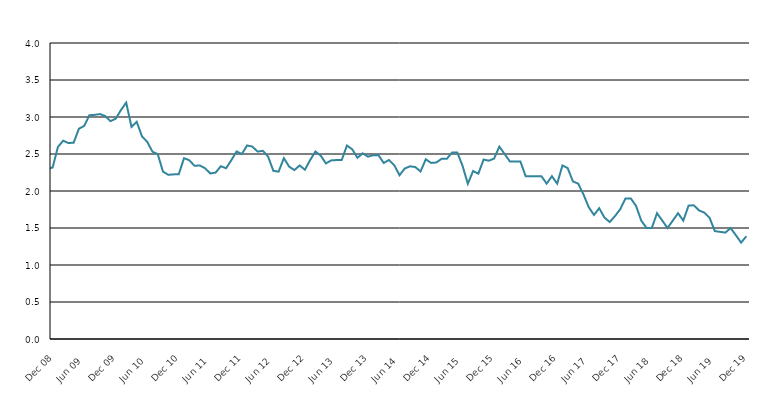
| Category | Series 1 |
|---|---|
| 2006-01-01 | 3.5 |
| 2006-02-01 | 3.4 |
| 2006-03-01 | 3.5 |
| 2006-04-01 | 3.4 |
| 2006-05-01 | 3.2 |
| 2006-06-01 | 3 |
| 2006-07-01 | 3 |
| 2006-08-01 | 3.2 |
| 2006-09-01 | 3.1 |
| 2006-10-01 | 3.1 |
| 2006-11-01 | 3 |
| 2006-12-01 | 3.3 |
| 2007-01-01 | 3.4 |
| 2007-02-01 | 3.3 |
| 2007-03-01 | 3.1 |
| 2007-04-01 | 2.8 |
| 2007-05-01 | 2.6 |
| 2007-06-01 | 2.7 |
| 2007-07-01 | 2.8 |
| 2007-08-01 | 2.9 |
| 2007-09-01 | 2.8 |
| 2007-10-01 | 2.7 |
| 2007-11-01 | 2.7 |
| 2007-12-01 | 2.7 |
| 2008-01-01 | 2.59 |
| 2008-02-01 | 2.48 |
| 2008-03-01 | 2.513 |
| 2008-04-01 | 2.397 |
| 2008-05-01 | 2.075 |
| 2008-06-01 | 2.136 |
| 2008-07-01 | 2.225 |
| 2008-08-01 | 2.259 |
| 2008-09-01 | 2.125 |
| 2008-10-01 | 2.181 |
| 2008-11-01 | 2.297 |
| 2008-12-01 | 2.318 |
| 2009-01-01 | 2.594 |
| 2009-02-01 | 2.68 |
| 2009-03-01 | 2.648 |
| 2009-04-01 | 2.653 |
| 2009-05-01 | 2.842 |
| 2009-06-01 | 2.879 |
| 2009-07-01 | 3.024 |
| 2009-08-01 | 3.029 |
| 2009-09-01 | 3.04 |
| 2009-10-01 | 3.013 |
| 2009-11-01 | 2.943 |
| 2009-12-01 | 2.978 |
| 2010-01-01 | 3.094 |
| 2010-02-01 | 3.195 |
| 2010-03-01 | 2.866 |
| 2010-04-01 | 2.935 |
| 2010-05-01 | 2.739 |
| 2010-06-01 | 2.664 |
| 2010-07-01 | 2.53 |
| 2010-08-01 | 2.498 |
| 2010-09-01 | 2.262 |
| 2010-10-01 | 2.219 |
| 2010-11-01 | 2.224 |
| 2010-12-01 | 2.226 |
| 2011-01-01 | 2.443 |
| 2011-02-01 | 2.416 |
| 2011-03-01 | 2.34 |
| 2011-04-01 | 2.346 |
| 2011-05-01 | 2.308 |
| 2011-06-01 | 2.237 |
| 2011-07-01 | 2.248 |
| 2011-08-01 | 2.335 |
| 2011-09-01 | 2.308 |
| 2011-10-01 | 2.416 |
| 2011-11-01 | 2.535 |
| 2011-12-01 | 2.5 |
| 2012-01-01 | 2.616 |
| 2012-02-01 | 2.6 |
| 2012-03-01 | 2.533 |
| 2012-04-01 | 2.543 |
| 2012-05-01 | 2.465 |
| 2012-06-01 | 2.272 |
| 2012-07-01 | 2.262 |
| 2012-08-01 | 2.444 |
| 2012-09-01 | 2.33 |
| 2012-10-01 | 2.283 |
| 2012-11-01 | 2.345 |
| 2012-12-01 | 2.287 |
| 2013-01-01 | 2.418 |
| 2013-02-01 | 2.534 |
| 2013-03-01 | 2.479 |
| 2013-04-01 | 2.373 |
| 2013-05-01 | 2.413 |
| 2013-06-01 | 2.418 |
| 2013-07-01 | 2.418 |
| 2013-08-01 | 2.614 |
| 2013-09-01 | 2.564 |
| 2013-10-01 | 2.449 |
| 2013-11-01 | 2.509 |
| 2013-12-01 | 2.464 |
| 2014-01-01 | 2.484 |
| 2014-02-01 | 2.484 |
| 2014-03-01 | 2.379 |
| 2014-04-01 | 2.419 |
| 2014-05-01 | 2.349 |
| 2014-06-01 | 2.213 |
| 2014-07-01 | 2.304 |
| 2014-08-01 | 2.334 |
| 2014-09-01 | 2.324 |
| 2014-10-01 | 2.264 |
| 2014-11-01 | 2.429 |
| 2014-12-01 | 2.38 |
| 2015-01-01 | 2.385 |
| 2015-02-01 | 2.435 |
| 2015-03-01 | 2.435 |
| 2015-04-01 | 2.52 |
| 2015-05-01 | 2.52 |
| 2015-06-01 | 2.339 |
| 2015-07-01 | 2.098 |
| 2015-08-01 | 2.269 |
| 2015-09-01 | 2.234 |
| 2015-10-01 | 2.425 |
| 2015-11-01 | 2.41 |
| 2015-12-01 | 2.438 |
| 2016-01-01 | 2.6 |
| 2016-02-01 | 2.5 |
| 2016-03-01 | 2.4 |
| 2016-04-01 | 2.4 |
| 2016-05-01 | 2.4 |
| 2016-06-01 | 2.2 |
| 2016-07-01 | 2.2 |
| 2016-08-01 | 2.2 |
| 2016-09-01 | 2.2 |
| 2016-10-01 | 2.1 |
| 2016-11-01 | 2.2 |
| 2016-12-01 | 2.1 |
| 2017-01-01 | 2.344 |
| 2017-02-01 | 2.31 |
| 2017-03-01 | 2.13 |
| 2017-04-01 | 2.099 |
| 2017-05-01 | 1.954 |
| 2017-06-01 | 1.783 |
| 2017-07-01 | 1.677 |
| 2017-08-01 | 1.767 |
| 2017-09-01 | 1.641 |
| 2017-10-01 | 1.58 |
| 2017-11-01 | 1.661 |
| 2017-12-01 | 1.754 |
| 2018-01-01 | 1.9 |
| 2018-02-01 | 1.9 |
| 2018-03-01 | 1.8 |
| 2018-04-01 | 1.6 |
| 2018-05-01 | 1.5 |
| 2018-06-01 | 1.5 |
| 2018-07-01 | 1.7 |
| 2018-08-01 | 1.6 |
| 2018-09-01 | 1.5 |
| 2018-10-01 | 1.6 |
| 2018-11-01 | 1.7 |
| 2018-12-01 | 1.6 |
| 2019-01-01 | 1.802 |
| 2019-02-01 | 1.807 |
| 2019-03-01 | 1.738 |
| 2019-04-01 | 1.708 |
| 2019-05-01 | 1.638 |
| 2019-06-01 | 1.458 |
| 2019-07-01 | 1.448 |
| 2019-08-01 | 1.438 |
| 2019-09-01 | 1.498 |
| 2019-10-01 | 1.403 |
| 2019-11-01 | 1.303 |
| 2019-12-01 | 1.389 |